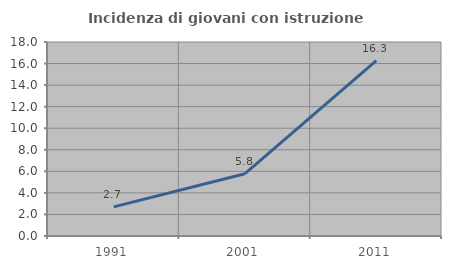
| Category | Incidenza di giovani con istruzione universitaria |
|---|---|
| 1991.0 | 2.703 |
| 2001.0 | 5.779 |
| 2011.0 | 16.273 |